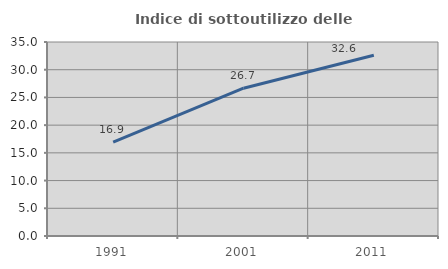
| Category | Indice di sottoutilizzo delle abitazioni  |
|---|---|
| 1991.0 | 16.92 |
| 2001.0 | 26.662 |
| 2011.0 | 32.617 |